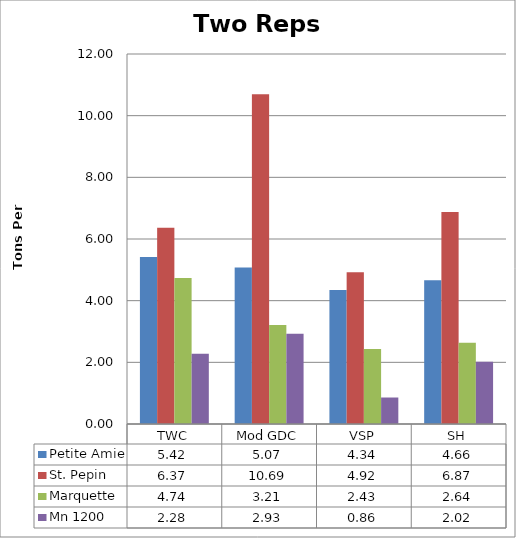
| Category | Petite Amie | St. Pepin | Marquette | Mn 1200 |
|---|---|---|---|---|
| 0 | 5.417 | 6.367 | 4.739 | 2.281 |
| 1 | 5.072 | 10.694 | 3.211 | 2.93 |
| 2 | 4.344 | 4.921 | 2.43 | 0.859 |
| 3 | 4.665 | 6.873 | 2.638 | 2.019 |